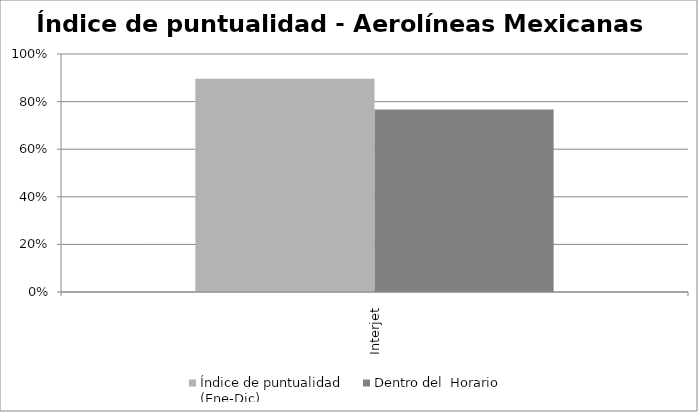
| Category | Índice de puntualidad
(Ene-Dic) | Dentro del  Horario |
|---|---|---|
| Interjet | 0.896 | 0.767 |